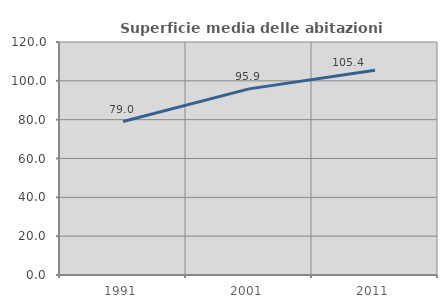
| Category | Superficie media delle abitazioni occupate |
|---|---|
| 1991.0 | 79.028 |
| 2001.0 | 95.859 |
| 2011.0 | 105.399 |